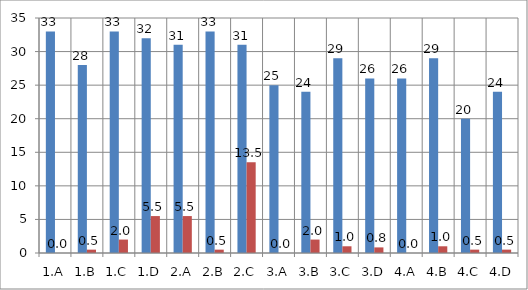
| Category | Series 0 | Series 1 |
|---|---|---|
| 1.A | 33 | 0 |
| 1.B | 28 | 0.5 |
| 1.C | 33 | 2 |
| 1.D | 32 | 5.5 |
| 2.A | 31 | 5.5 |
| 2.B | 33 | 0.5 |
| 2.C | 31 | 13.5 |
| 3.A | 25 | 0 |
| 3.B | 24 | 2 |
| 3.C | 29 | 1 |
| 3.D | 26 | 0.833 |
| 4.A | 26 | 0 |
| 4.B | 29 | 1 |
| 4.C | 20 | 0.5 |
| 4.D | 24 | 0.5 |